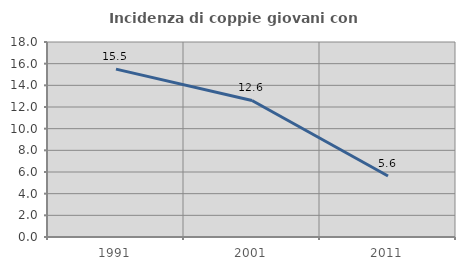
| Category | Incidenza di coppie giovani con figli |
|---|---|
| 1991.0 | 15.493 |
| 2001.0 | 12.601 |
| 2011.0 | 5.634 |